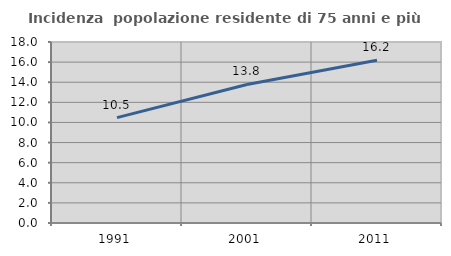
| Category | Incidenza  popolazione residente di 75 anni e più |
|---|---|
| 1991.0 | 10.48 |
| 2001.0 | 13.78 |
| 2011.0 | 16.192 |